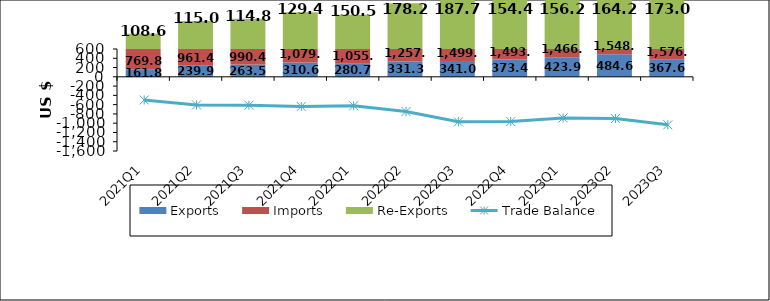
| Category | Exports | Imports | Re-Exports |
|---|---|---|---|
| 2021Q1 | 161.833 | 769.764 | 108.588 |
| 2021Q2 | 239.882 | 961.439 | 114.995 |
| 2021Q3 | 263.451 | 990.421 | 114.805 |
| 2021Q4 | 310.56 | 1079.656 | 129.387 |
| 2022Q1 | 280.673 | 1055.385 | 150.457 |
| 2022Q2 | 331.325 | 1257.717 | 178.235 |
| 2022Q3 | 341.036 | 1499.805 | 187.729 |
| 2022Q4 | 373.389 | 1493.34 | 154.392 |
| 2023Q1 | 423.886 | 1466.903 | 156.235 |
| 2023Q2 | 484.639 | 1548.799 | 164.233 |
| 2023Q3 | 367.611 | 1575.967 | 172.989 |